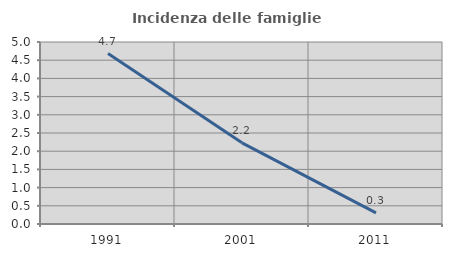
| Category | Incidenza delle famiglie numerose |
|---|---|
| 1991.0 | 4.682 |
| 2001.0 | 2.229 |
| 2011.0 | 0.305 |